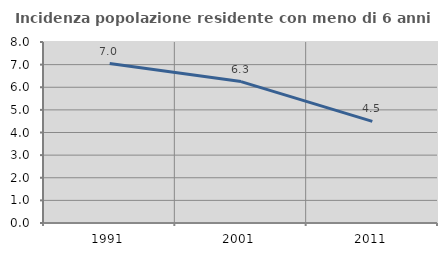
| Category | Incidenza popolazione residente con meno di 6 anni |
|---|---|
| 1991.0 | 7.047 |
| 2001.0 | 6.25 |
| 2011.0 | 4.494 |